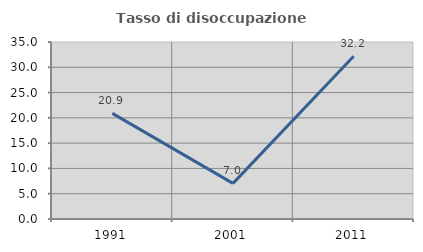
| Category | Tasso di disoccupazione giovanile  |
|---|---|
| 1991.0 | 20.879 |
| 2001.0 | 7.042 |
| 2011.0 | 32.184 |